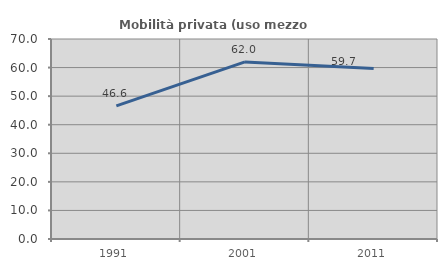
| Category | Mobilità privata (uso mezzo privato) |
|---|---|
| 1991.0 | 46.603 |
| 2001.0 | 61.985 |
| 2011.0 | 59.686 |